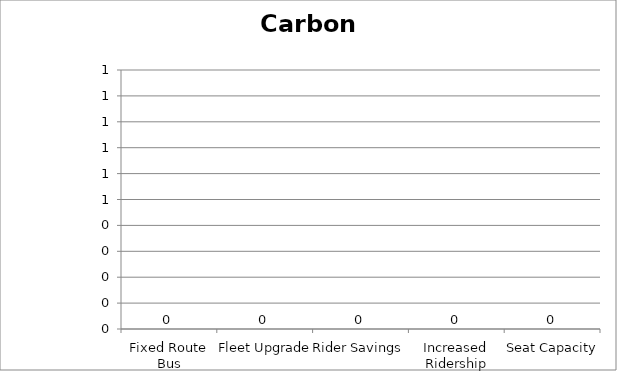
| Category | Carbon Monoxide |
|---|---|
| Fixed Route Bus | 0 |
| Fleet Upgrade | 0 |
| Rider Savings | 0 |
| Increased Ridership | 0 |
| Seat Capacity | 0 |